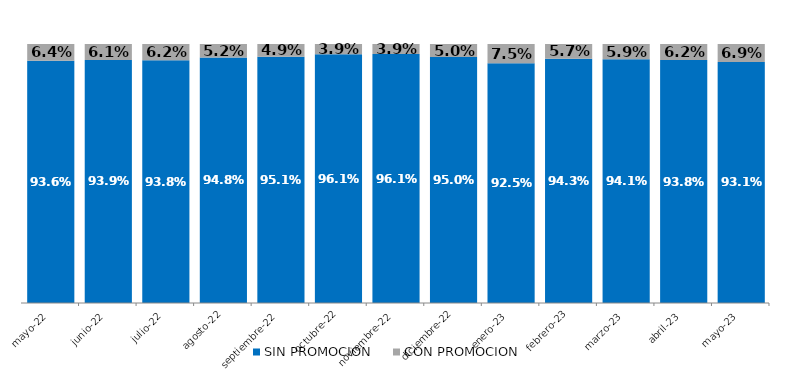
| Category | SIN PROMOCION   | CON PROMOCION   |
|---|---|---|
| 2022-05-01 | 0.936 | 0.064 |
| 2022-06-01 | 0.939 | 0.061 |
| 2022-07-01 | 0.938 | 0.062 |
| 2022-08-01 | 0.948 | 0.052 |
| 2022-09-01 | 0.951 | 0.049 |
| 2022-10-01 | 0.961 | 0.039 |
| 2022-11-01 | 0.961 | 0.039 |
| 2022-12-01 | 0.95 | 0.05 |
| 2023-01-01 | 0.925 | 0.075 |
| 2023-02-01 | 0.943 | 0.057 |
| 2023-03-01 | 0.941 | 0.059 |
| 2023-04-01 | 0.938 | 0.062 |
| 2023-05-01 | 0.931 | 0.069 |